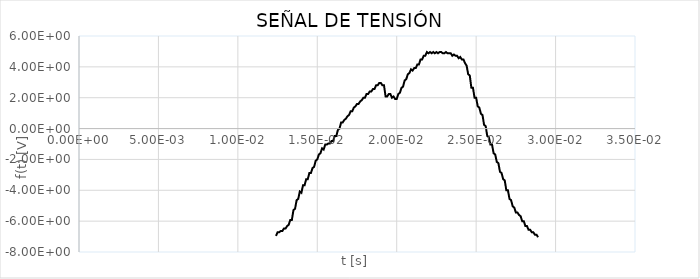
| Category | f(t) |
|---|---|
| 0.0124 | -6.96 |
| 0.0125 | -6.72 |
| 0.0126 | -6.72 |
| 0.0127 | -6.64 |
| 0.0128 | -6.64 |
| 0.0129 | -6.48 |
| 0.013 | -6.48 |
| 0.0131 | -6.32 |
| 0.0132 | -6.24 |
| 0.0133 | -5.92 |
| 0.0134 | -5.92 |
| 0.0135 | -5.28 |
| 0.0136 | -5.2 |
| 0.0137 | -4.64 |
| 0.0138 | -4.56 |
| 0.0139 | -4.08 |
| 0.014 | -4.16 |
| 0.0141 | -3.68 |
| 0.0142 | -3.68 |
| 0.0143 | -3.28 |
| 0.0144 | -3.28 |
| 0.0145 | -2.88 |
| 0.0146 | -2.88 |
| 0.0147 | -2.56 |
| 0.0148 | -2.48 |
| 0.0149 | -2.08 |
| 0.015 | -2 |
| 0.0151 | -1.68 |
| 0.0152 | -1.6 |
| 0.0153 | -1.28 |
| 0.0154 | -1.36 |
| 0.0155 | -1.04 |
| 0.0156 | -1.04 |
| 0.0157 | -0.96 |
| 0.0158 | -0.96 |
| 0.0159 | -0.8 |
| 0.016 | -0.8 |
| 0.0161 | -0.48 |
| 0.0162 | -0.48 |
| 0.0163 | -0.08 |
| 0.0164 | 0 |
| 0.0165 | 0.4 |
| 0.0166 | 0.4 |
| 0.0167 | 0.56 |
| 0.0168 | 0.64 |
| 0.0169 | 0.8 |
| 0.017 | 0.88 |
| 0.0171 | 1.12 |
| 0.0172 | 1.12 |
| 0.0173 | 1.36 |
| 0.0174 | 1.44 |
| 0.0175 | 1.6 |
| 0.0176 | 1.6 |
| 0.0177 | 1.76 |
| 0.0178 | 1.84 |
| 0.0179 | 2 |
| 0.018 | 2 |
| 0.0181 | 2.24 |
| 0.0182 | 2.24 |
| 0.0183 | 2.4 |
| 0.0184 | 2.4 |
| 0.0185 | 2.56 |
| 0.0186 | 2.56 |
| 0.0187 | 2.8 |
| 0.0188 | 2.8 |
| 0.0189 | 2.96 |
| 0.019 | 2.96 |
| 0.0191 | 2.8 |
| 0.0192 | 2.8 |
| 0.0193 | 2.08 |
| 0.0194 | 2.08 |
| 0.0195 | 2.24 |
| 0.0196 | 2.24 |
| 0.0197 | 2 |
| 0.0198 | 2.08 |
| 0.0199 | 1.92 |
| 0.02 | 1.92 |
| 0.0201 | 2.24 |
| 0.0202 | 2.32 |
| 0.0203 | 2.64 |
| 0.0204 | 2.72 |
| 0.0205 | 3.12 |
| 0.0206 | 3.2 |
| 0.0207 | 3.52 |
| 0.0208 | 3.6 |
| 0.0209 | 3.84 |
| 0.021 | 3.76 |
| 0.0211 | 3.92 |
| 0.0212 | 3.92 |
| 0.0213 | 4.16 |
| 0.0214 | 4.16 |
| 0.0215 | 4.48 |
| 0.0216 | 4.48 |
| 0.0217 | 4.72 |
| 0.0218 | 4.72 |
| 0.0219 | 4.96 |
| 0.022 | 4.88 |
| 0.0221 | 4.96 |
| 0.0222 | 4.88 |
| 0.0223 | 4.96 |
| 0.0224 | 4.88 |
| 0.0225 | 4.96 |
| 0.0226 | 4.88 |
| 0.0227 | 4.96 |
| 0.0228 | 4.96 |
| 0.0229 | 4.88 |
| 0.023 | 4.88 |
| 0.0231 | 4.96 |
| 0.0232 | 4.88 |
| 0.0233 | 4.88 |
| 0.0234 | 4.88 |
| 0.0235 | 4.72 |
| 0.0236 | 4.8 |
| 0.0237 | 4.72 |
| 0.0238 | 4.72 |
| 0.0239 | 4.56 |
| 0.024 | 4.64 |
| 0.0241 | 4.48 |
| 0.0242 | 4.48 |
| 0.0243 | 4.24 |
| 0.0244 | 4.08 |
| 0.0245 | 3.52 |
| 0.0246 | 3.44 |
| 0.0247 | 2.64 |
| 0.0248 | 2.64 |
| 0.0249 | 2 |
| 0.025 | 2 |
| 0.0251 | 1.44 |
| 0.0252 | 1.36 |
| 0.0253 | 0.96 |
| 0.0254 | 0.88 |
| 0.0255 | 0.24 |
| 0.0256 | 0.16 |
| 0.0257 | -0.48 |
| 0.0258 | -0.56 |
| 0.0259 | -1.04 |
| 0.026 | -1.04 |
| 0.0261 | -1.6 |
| 0.0262 | -1.68 |
| 0.0263 | -2.16 |
| 0.0264 | -2.24 |
| 0.0265 | -2.8 |
| 0.0266 | -2.88 |
| 0.0267 | -3.28 |
| 0.0268 | -3.36 |
| 0.0269 | -4 |
| 0.027 | -4 |
| 0.0271 | -4.56 |
| 0.0272 | -4.64 |
| 0.0273 | -5.04 |
| 0.0274 | -5.12 |
| 0.0275 | -5.44 |
| 0.0276 | -5.44 |
| 0.0277 | -5.6 |
| 0.0278 | -5.68 |
| 0.0279 | -6 |
| 0.028 | -6 |
| 0.0281 | -6.32 |
| 0.0282 | -6.32 |
| 0.0283 | -6.56 |
| 0.0284 | -6.56 |
| 0.0285 | -6.72 |
| 0.0286 | -6.72 |
| 0.0287 | -6.88 |
| 0.0288 | -6.88 |
| 0.0289 | -7.04 |